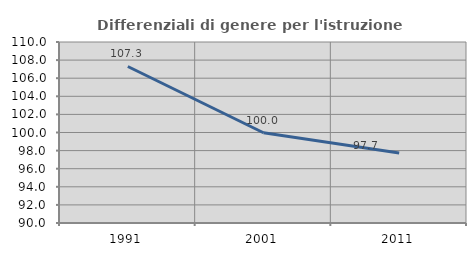
| Category | Differenziali di genere per l'istruzione superiore |
|---|---|
| 1991.0 | 107.294 |
| 2001.0 | 99.973 |
| 2011.0 | 97.738 |